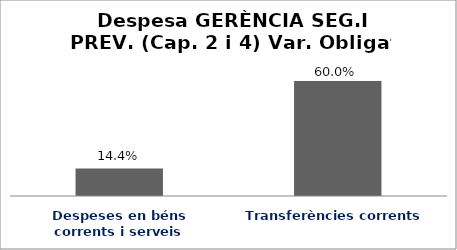
| Category | Series 0 |
|---|---|
| Despeses en béns corrents i serveis | 0.144 |
| Transferències corrents | 0.6 |